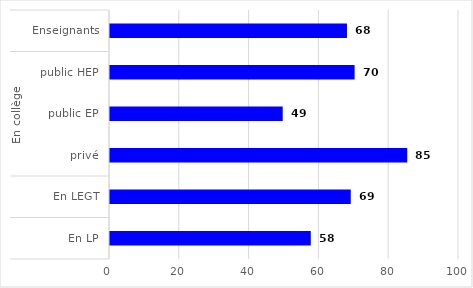
| Category | Series 0 |
|---|---|
| 0 | 67.903 |
| 1 | 70.09 |
| 2 | 49.49 |
| 3 | 85.172 |
| 4 | 68.985 |
| 5 | 57.529 |